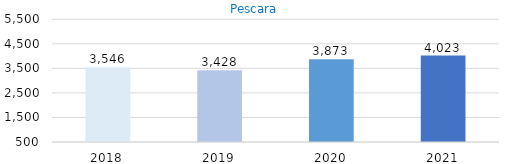
| Category | Pescara |
|---|---|
| 2018.0 | 3546 |
| 2019.0 | 3428 |
| 2020.0 | 3873 |
| 2021.0 | 4023 |